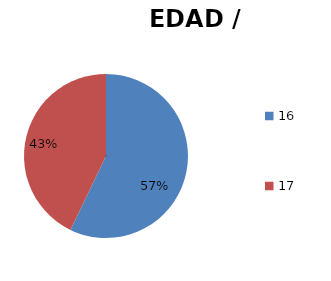
| Category | EDAD / DETENIDOS |
|---|---|
| 16.0 | 4 |
| 17.0 | 3 |